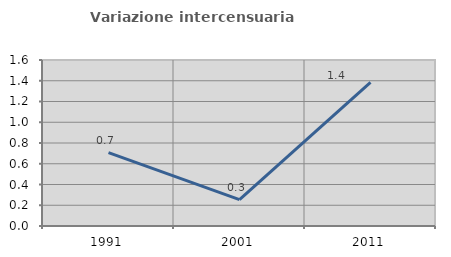
| Category | Variazione intercensuaria annua |
|---|---|
| 1991.0 | 0.707 |
| 2001.0 | 0.254 |
| 2011.0 | 1.384 |